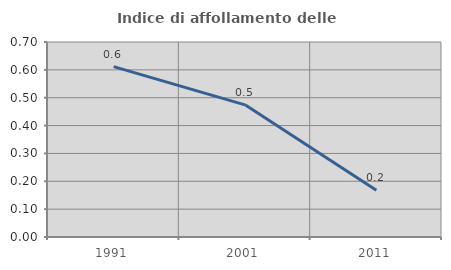
| Category | Indice di affollamento delle abitazioni  |
|---|---|
| 1991.0 | 0.612 |
| 2001.0 | 0.474 |
| 2011.0 | 0.168 |